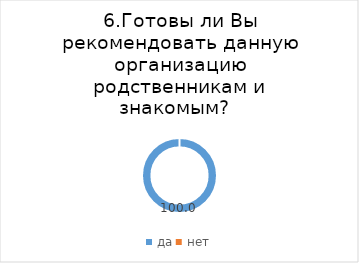
| Category | Series 0 |
|---|---|
| да | 100 |
| нет | 0 |